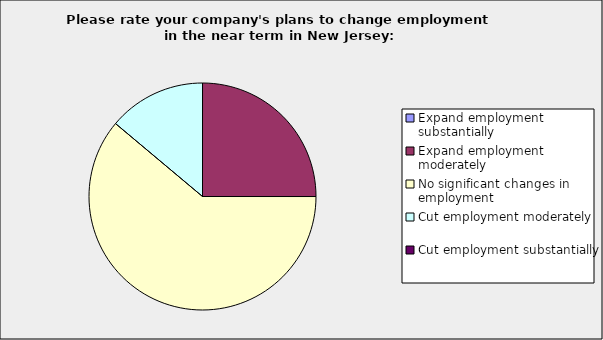
| Category | Series 0 |
|---|---|
| Expand employment substantially | 0 |
| Expand employment moderately | 0.25 |
| No significant changes in employment | 0.611 |
| Cut employment moderately | 0.139 |
| Cut employment substantially | 0 |